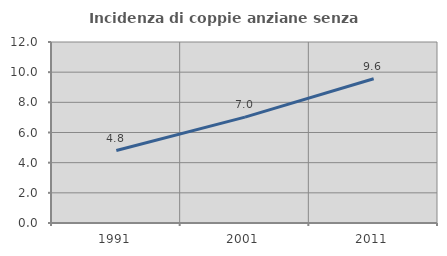
| Category | Incidenza di coppie anziane senza figli  |
|---|---|
| 1991.0 | 4.805 |
| 2001.0 | 7.018 |
| 2011.0 | 9.563 |